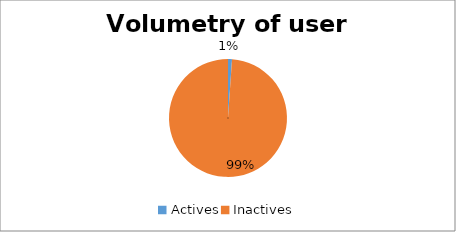
| Category | Count |
|---|---|
| Actives | 10 |
| Inactives | 907 |